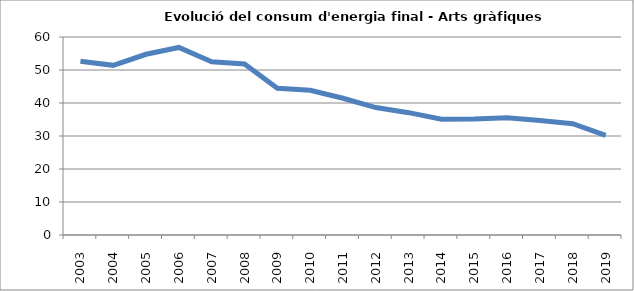
| Category | 52,6 |
|---|---|
| 2003.0 | 52.62 |
| 2004.0 | 51.41 |
| 2005.0 | 54.76 |
| 2006.0 | 56.83 |
| 2007.0 | 52.47 |
| 2008.0 | 51.8 |
| 2009.0 | 44.48 |
| 2010.0 | 43.86 |
| 2011.0 | 41.44 |
| 2012.0 | 38.62 |
| 2013.0 | 37.07 |
| 2014.0 | 35.06 |
| 2015.0 | 35.14 |
| 2016.0 | 35.54 |
| 2017.0 | 34.73 |
| 2018.0 | 33.71 |
| 2019.0 | 30.18 |